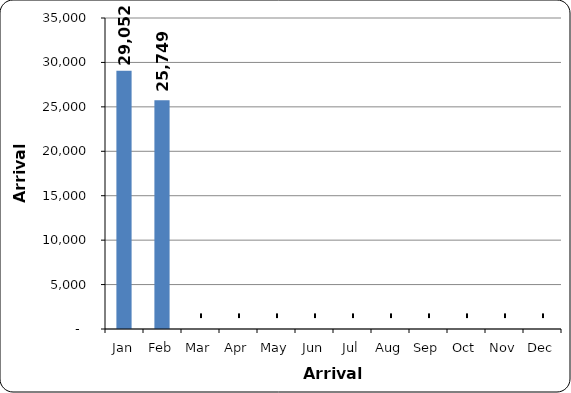
| Category | Total No. |
|---|---|
| Jan | 29052 |
| Feb | 25749 |
| Mar | 0 |
| Apr | 0 |
| May | 0 |
| Jun | 0 |
| Jul | 0 |
| Aug | 0 |
| Sep | 0 |
| Oct | 0 |
| Nov | 0 |
| Dec | 0 |